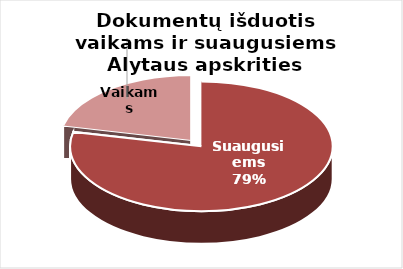
| Category | Series 0 |
|---|---|
| Suaugusiems | 868955 |
| Vaikams | 237012 |